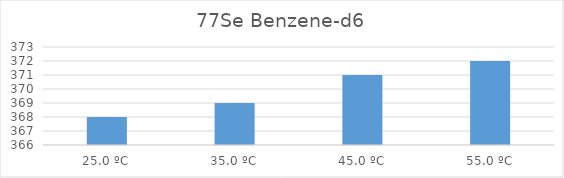
| Category | 77Se Benzene-d6 |
|---|---|
| 25.0 ºC | 368 |
| 35.0 ºC | 369 |
| 45.0 ºC | 371 |
| 55.0 ºC | 372 |